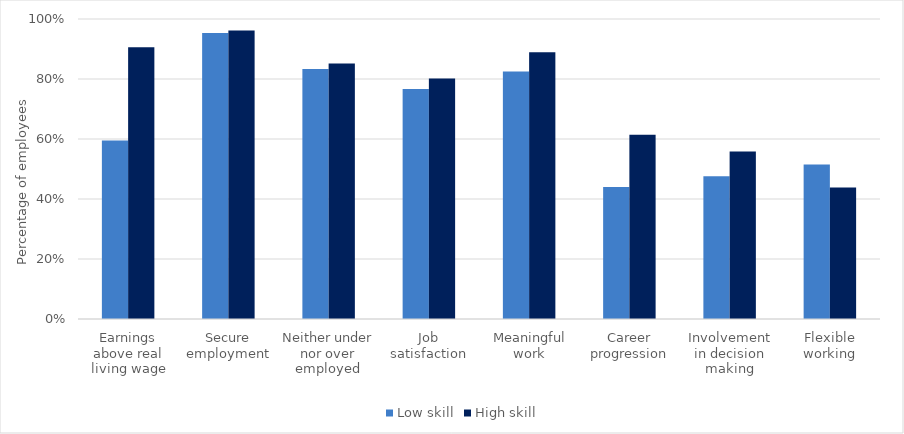
| Category | Low skill | High skill |
|---|---|---|
| Earnings above real living wage | 0.595 | 0.906 |
| Secure employment | 0.953 | 0.962 |
| Neither under nor over employed | 0.833 | 0.852 |
| Job satisfaction | 0.767 | 0.802 |
| Meaningful work | 0.825 | 0.889 |
| Career progression | 0.44 | 0.614 |
| Involvement in decision making | 0.476 | 0.558 |
| Flexible working | 0.515 | 0.438 |